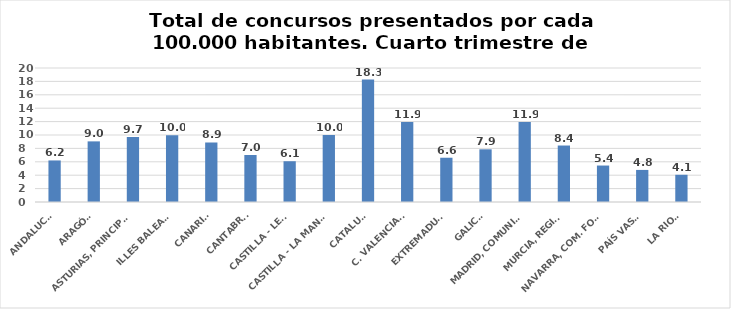
| Category | Series 0 |
|---|---|
| ANDALUCÍA | 6.202 |
| ARAGÓN | 9.048 |
| ASTURIAS, PRINCIPADO | 9.686 |
| ILLES BALEARS | 9.974 |
| CANARIAS | 8.882 |
| CANTABRIA | 7.014 |
| CASTILLA - LEÓN | 6.084 |
| CASTILLA - LA MANCHA | 10.002 |
| CATALUÑA | 18.278 |
| C. VALENCIANA | 11.941 |
| EXTREMADURA | 6.607 |
| GALICIA | 7.865 |
| MADRID, COMUNIDAD | 11.939 |
| MURCIA, REGIÓN | 8.429 |
| NAVARRA, COM. FORAL | 5.442 |
| PAÍS VASCO | 4.788 |
| LA RIOJA | 4.065 |